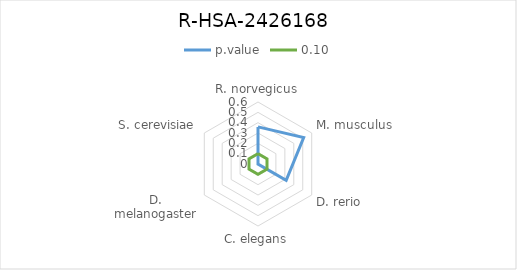
| Category | p.value | 0.10 |
|---|---|---|
| R. norvegicus | 0.359 | 0.1 |
| M. musculus | 0.51 | 0.1 |
| D. rerio | 0.315 | 0.1 |
| C. elegans | 0.001 | 0.1 |
| D. melanogaster | 0.003 | 0.1 |
| S. cerevisiae | 0 | 0.1 |